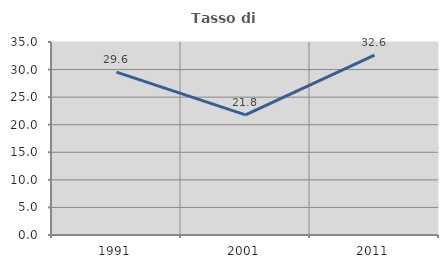
| Category | Tasso di occupazione   |
|---|---|
| 1991.0 | 29.55 |
| 2001.0 | 21.795 |
| 2011.0 | 32.618 |